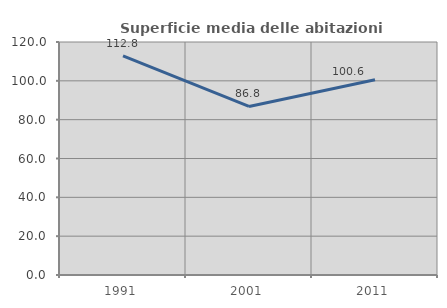
| Category | Superficie media delle abitazioni occupate |
|---|---|
| 1991.0 | 112.828 |
| 2001.0 | 86.803 |
| 2011.0 | 100.601 |